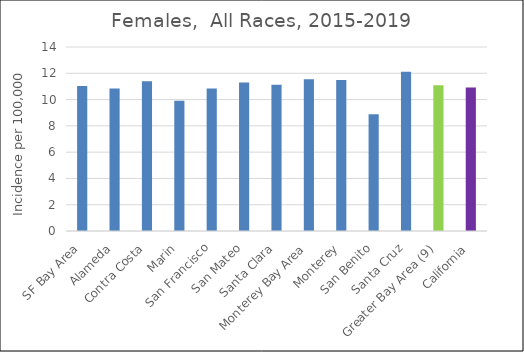
| Category | Female |
|---|---|
| SF Bay Area | 11.03 |
|   Alameda | 10.84 |
|   Contra Costa | 11.39 |
|   Marin | 9.91 |
|   San Francisco | 10.84 |
|   San Mateo | 11.3 |
|   Santa Clara | 11.12 |
| Monterey Bay Area | 11.55 |
|   Monterey | 11.48 |
|   San Benito | 8.88 |
|   Santa Cruz | 12.12 |
| Greater Bay Area (9) | 11.09 |
| California | 10.91 |